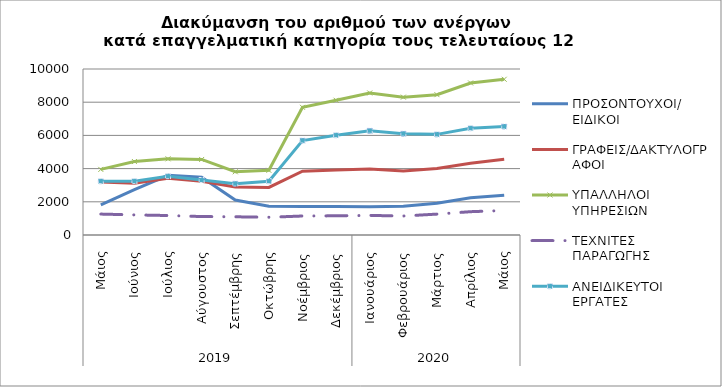
| Category | ΠΡΟΣΟΝΤΟΥΧΟΙ/  ΕΙΔΙΚΟΙ | ΓΡΑΦΕΙΣ/ΔΑΚΤΥΛΟΓΡΑΦΟΙ | ΥΠΑΛΛΗΛΟΙ ΥΠΗΡΕΣΙΩΝ | ΤΕΧΝΙΤΕΣ ΠΑΡΑΓΩΓΗΣ | ΑΝΕΙΔΙΚΕΥΤΟΙ ΕΡΓΑΤΕΣ |
|---|---|---|---|---|---|
| 0 | 1813 | 3199 | 3952 | 1260 | 3240 |
| 1 | 2731 | 3112 | 4425 | 1211 | 3242 |
| 2 | 3596 | 3417 | 4589 | 1173 | 3539 |
| 3 | 3481 | 3236 | 4551 | 1111 | 3312 |
| 4 | 2104 | 2890 | 3809 | 1097 | 3094 |
| 5 | 1735 | 2865 | 3896 | 1068 | 3242 |
| 6 | 1719 | 3843 | 7692 | 1144 | 5690 |
| 7 | 1724 | 3914 | 8117 | 1155 | 6012 |
| 8 | 1702 | 3980 | 8556 | 1179 | 6279 |
| 9 | 1728 | 3859 | 8305 | 1145 | 6104 |
| 10 | 1918 | 4001 | 8454 | 1258 | 6062 |
| 11 | 2246 | 4325 | 9159 | 1405 | 6433 |
| 12 | 2398 | 4567 | 9381 | 1474 | 6537 |